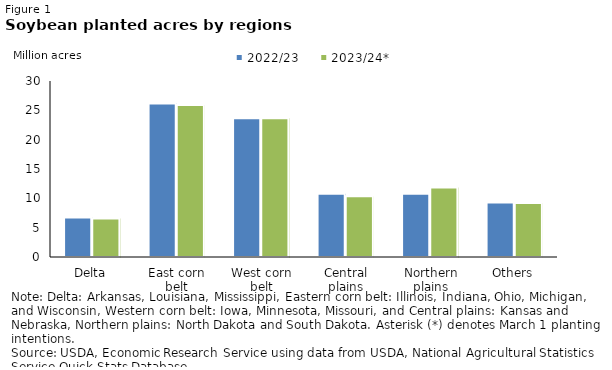
| Category | 2022/23 | 2023/24* |
|---|---|---|
| Delta | 6.75 | 6.57 |
| East corn belt | 26.16 | 25.9 |
| West corn belt | 23.65 | 23.65 |
| Central plains | 10.8 | 10.35 |
| Northern plains | 10.8 | 11.85 |
| Others | 9.29 | 9.185 |